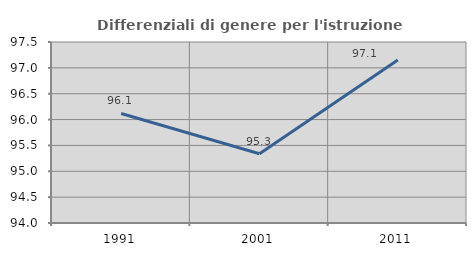
| Category | Differenziali di genere per l'istruzione superiore |
|---|---|
| 1991.0 | 96.117 |
| 2001.0 | 95.338 |
| 2011.0 | 97.15 |